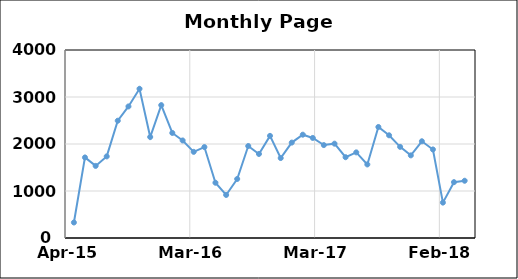
| Category | Series 0 |
|---|---|
| 42125.0 | 330 |
| 42156.0 | 1714 |
| 42186.0 | 1534 |
| 42217.0 | 1736 |
| 42248.0 | 2495 |
| 42278.0 | 2799 |
| 42309.0 | 3175 |
| 42339.0 | 2149 |
| 42370.0 | 2827 |
| 42401.0 | 2235 |
| 42430.0 | 2075 |
| 42461.0 | 1833 |
| 42491.0 | 1935 |
| 42522.0 | 1176 |
| 42552.0 | 916 |
| 42583.0 | 1256 |
| 42614.0 | 1957 |
| 42644.0 | 1788 |
| 42675.0 | 2173 |
| 42705.0 | 1701 |
| 42736.0 | 2030 |
| 42767.0 | 2198 |
| 42795.0 | 2129 |
| 42826.0 | 1977 |
| 42856.0 | 2007 |
| 42887.0 | 1719 |
| 42917.0 | 1822 |
| 42948.0 | 1565 |
| 42979.0 | 2362 |
| 43009.0 | 2185 |
| 43040.0 | 1939 |
| 43070.0 | 1758 |
| 43101.0 | 2058 |
| 43132.0 | 1884 |
| 43160.0 | 753 |
| 43191.0 | 1188 |
| 43221.0 | 1218 |